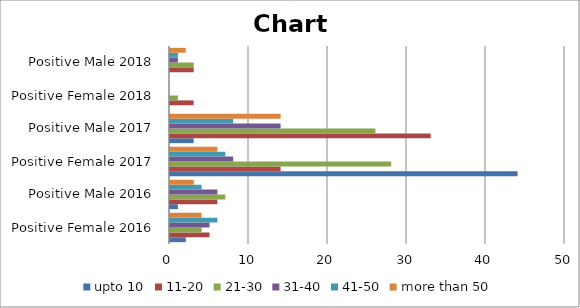
| Category | upto 10 | 11-20 | 21-30 | 31-40 | 41-50 | more than 50 |
|---|---|---|---|---|---|---|
| Positive Female 2016 | 2 | 5 | 4 | 5 | 6 | 4 |
| Positive Male 2016 | 1 | 6 | 7 | 6 | 4 | 3 |
| Positive Female 2017 | 44 | 14 | 28 | 8 | 7 | 6 |
| Positive Male 2017 | 3 | 33 | 26 | 14 | 8 | 14 |
| Positive Female 2018 | 0 | 3 | 1 | 0 | 0 | 0 |
| Positive Male 2018 | 0 | 3 | 3 | 1 | 1 | 2 |